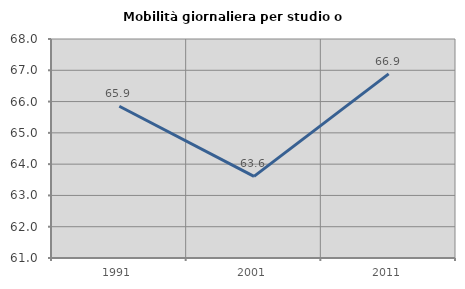
| Category | Mobilità giornaliera per studio o lavoro |
|---|---|
| 1991.0 | 65.852 |
| 2001.0 | 63.609 |
| 2011.0 | 66.887 |